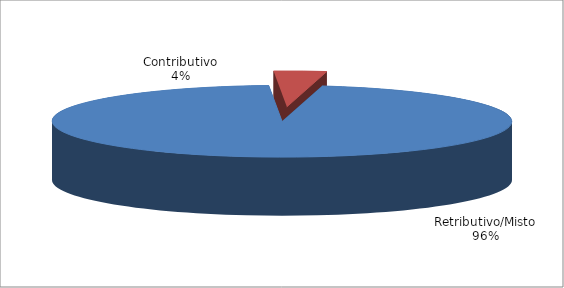
| Category | Series 1 |
|---|---|
| Retributivo/Misto | 31094 |
| Contributivo | 1194 |